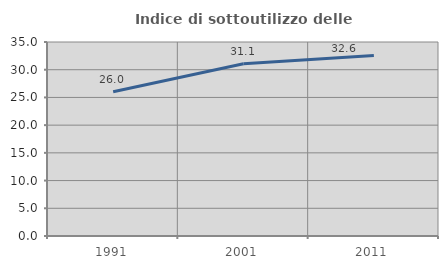
| Category | Indice di sottoutilizzo delle abitazioni  |
|---|---|
| 1991.0 | 26.02 |
| 2001.0 | 31.092 |
| 2011.0 | 32.584 |